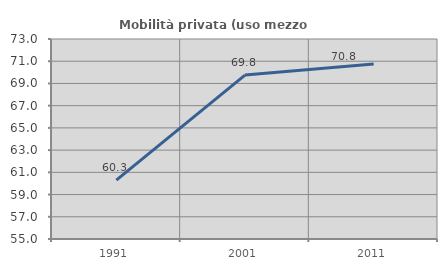
| Category | Mobilità privata (uso mezzo privato) |
|---|---|
| 1991.0 | 60.303 |
| 2001.0 | 69.753 |
| 2011.0 | 70.753 |